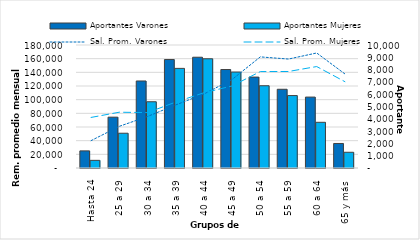
| Category | Aportantes Varones | Aportantes Mujeres |
|---|---|---|
| Hasta 24 | 1392 | 622 |
| 25 a 29 | 4133 | 2827 |
| 30 a 34 | 7075 | 5385 |
| 35 a 39 | 8818 | 8099 |
| 40 a 44 | 9006 | 8880 |
| 45 a 49 | 8006 | 7803 |
| 50 a 54 | 7392 | 6687 |
| 55 a 59 | 6401 | 5889 |
| 60 a 64 | 5765 | 3715 |
| 65 y más | 1994 | 1278 |